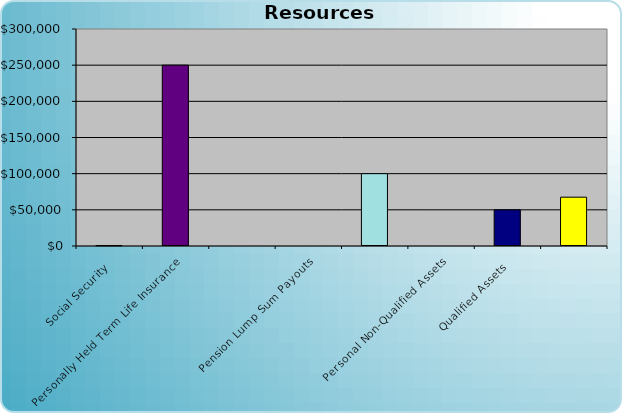
| Category | Series 0 |
|---|---|
| Social Security | 255 |
| Personally Held Term Life Insurance | 250000 |
|   | 0 |
| Pension Lump Sum Payouts | 0 |
|   | 100000 |
| Personal Non-Qualified Assets | 0 |
| Qualified Assets | 50000 |